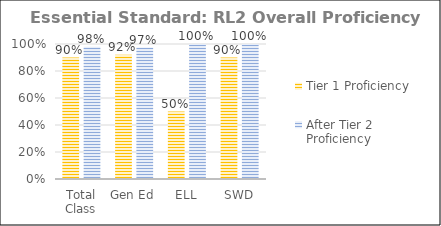
| Category | Tier 1 Proficiency | After Tier 2 Proficiency |
|---|---|---|
| Total Class | 0.9 | 0.98 |
| Gen Ed | 0.921 | 0.974 |
| ELL | 0.5 | 1 |
| SWD | 0.9 | 1 |